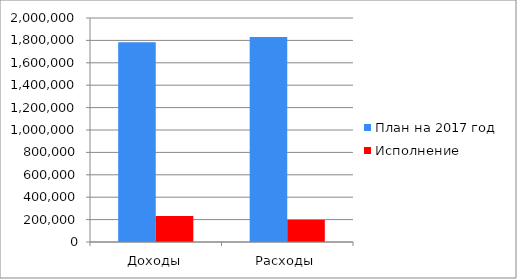
| Category | План на 2017 год | Исполнение |
|---|---|---|
| Доходы | 1783792.6 | 233182.5 |
| Расходы | 1830351.6 | 196438.5 |